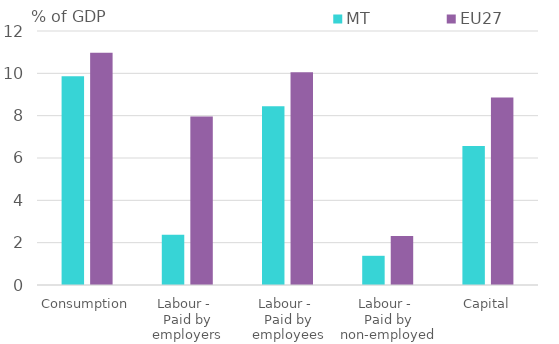
| Category | MT | EU27 |
|---|---|---|
| Consumption | 9.859 | 10.967 |
| Labour - 
Paid by employers | 2.378 | 7.966 |
| Labour - 
Paid by employees | 8.448 | 10.052 |
| Labour - 
Paid by non-employed | 1.38 | 2.311 |
| Capital | 6.563 | 8.858 |